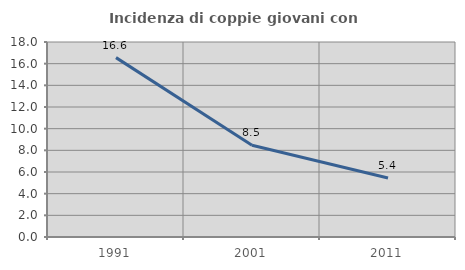
| Category | Incidenza di coppie giovani con figli |
|---|---|
| 1991.0 | 16.558 |
| 2001.0 | 8.464 |
| 2011.0 | 5.445 |